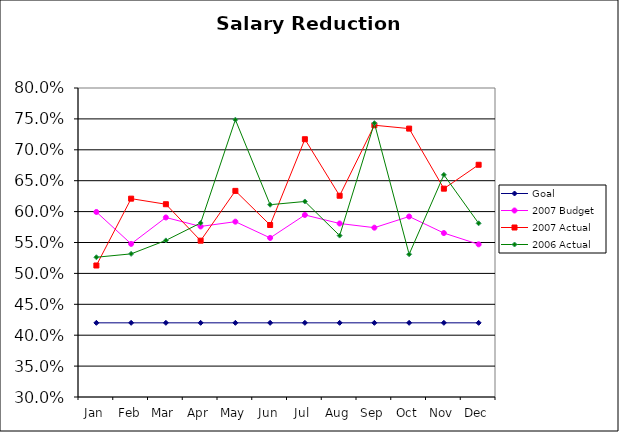
| Category | Goal | 2007 Budget | 2007 Actual | 2006 Actual |
|---|---|---|---|---|
| Jan | 0.42 | 0.599 | 0.513 | 0.526 |
| Feb | 0.42 | 0.548 | 0.621 | 0.532 |
| Mar | 0.42 | 0.59 | 0.612 | 0.553 |
| Apr | 0.42 | 0.576 | 0.553 | 0.582 |
| May | 0.42 | 0.584 | 0.634 | 0.749 |
| Jun | 0.42 | 0.557 | 0.578 | 0.611 |
| Jul | 0.42 | 0.595 | 0.717 | 0.616 |
| Aug | 0.42 | 0.581 | 0.626 | 0.561 |
| Sep | 0.42 | 0.574 | 0.74 | 0.743 |
| Oct | 0.42 | 0.592 | 0.734 | 0.531 |
| Nov | 0.42 | 0.565 | 0.637 | 0.659 |
| Dec | 0.42 | 0.547 | 0.676 | 0.581 |